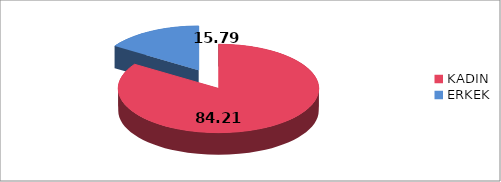
| Category | Series 0 |
|---|---|
| KADIN | 84.21 |
| ERKEK | 15.79 |